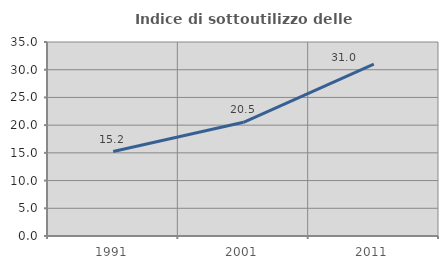
| Category | Indice di sottoutilizzo delle abitazioni  |
|---|---|
| 1991.0 | 15.241 |
| 2001.0 | 20.518 |
| 2011.0 | 31.024 |